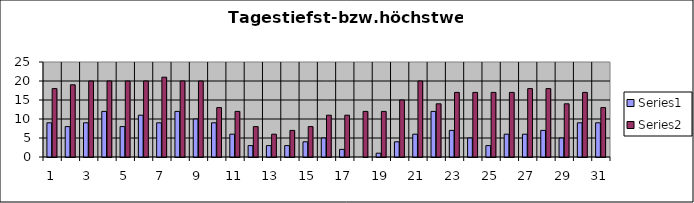
| Category | Series 0 | Series 1 |
|---|---|---|
| 0 | 9 | 18 |
| 1 | 8 | 19 |
| 2 | 9 | 20 |
| 3 | 12 | 20 |
| 4 | 8 | 20 |
| 5 | 11 | 20 |
| 6 | 9 | 21 |
| 7 | 12 | 20 |
| 8 | 10 | 20 |
| 9 | 9 | 13 |
| 10 | 6 | 12 |
| 11 | 3 | 8 |
| 12 | 3 | 6 |
| 13 | 3 | 7 |
| 14 | 4 | 8 |
| 15 | 5 | 11 |
| 16 | 2 | 11 |
| 17 | 0 | 12 |
| 18 | 1 | 12 |
| 19 | 4 | 15 |
| 20 | 6 | 20 |
| 21 | 12 | 14 |
| 22 | 7 | 17 |
| 23 | 5 | 17 |
| 24 | 3 | 17 |
| 25 | 6 | 17 |
| 26 | 6 | 18 |
| 27 | 7 | 18 |
| 28 | 5 | 14 |
| 29 | 9 | 17 |
| 30 | 9 | 13 |